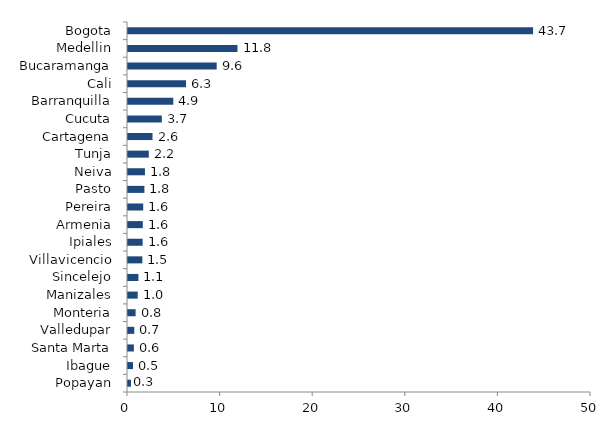
| Category | Series 0 |
|---|---|
| Popayan | 0.319 |
| Ibague | 0.539 |
| Santa Marta | 0.636 |
| Valledupar | 0.677 |
| Monteria | 0.821 |
| Manizales | 1.049 |
| Sincelejo | 1.126 |
| Villavicencio | 1.55 |
| Ipiales | 1.585 |
| Armenia | 1.598 |
| Pereira | 1.642 |
| Pasto | 1.77 |
| Neiva | 1.831 |
| Tunja | 2.247 |
| Cartagena | 2.646 |
| Cucuta | 3.653 |
| Barranquilla | 4.894 |
| Cali | 6.267 |
| Bucaramanga | 9.577 |
| Medellin | 11.825 |
| Bogota | 43.746 |